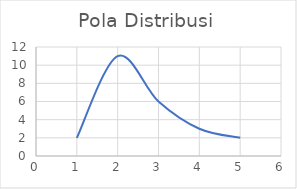
| Category | Pola Distribusi |
|---|---|
| 0 | 2 |
| 1 | 11 |
| 2 | 6 |
| 3 | 3 |
| 4 | 2 |